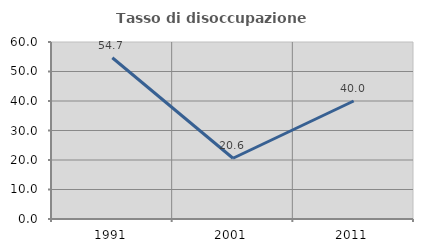
| Category | Tasso di disoccupazione giovanile  |
|---|---|
| 1991.0 | 54.667 |
| 2001.0 | 20.588 |
| 2011.0 | 40 |